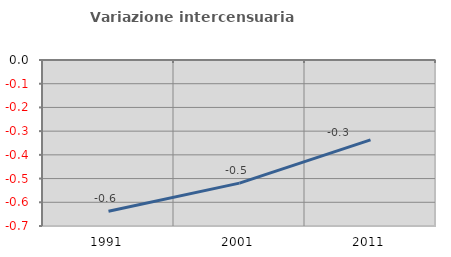
| Category | Variazione intercensuaria annua |
|---|---|
| 1991.0 | -0.638 |
| 2001.0 | -0.519 |
| 2011.0 | -0.337 |